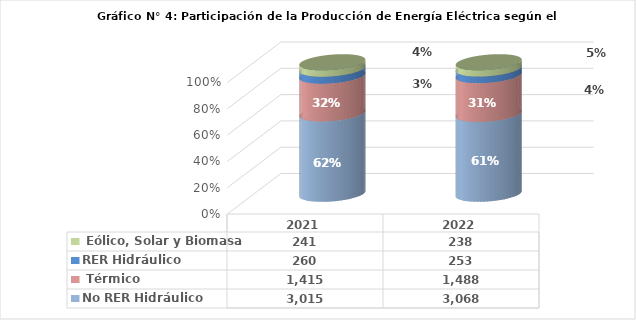
| Category | No RER | RER |
|---|---|---|
| 2021.0 | 1414.571 | 240.713 |
| 2022.0 | 1487.839 | 238.325 |